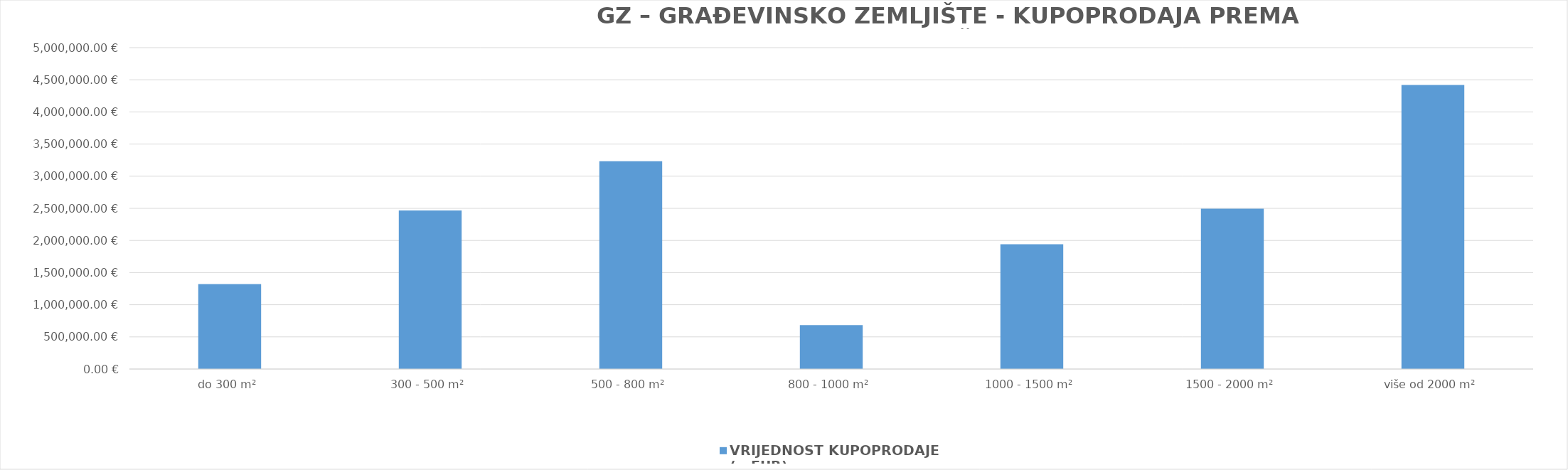
| Category | VRIJEDNOST KUPOPRODAJE (u EUR) |
|---|---|
| do 300 m² | 1322007.07 |
| 300 - 500 m² | 2467705.975 |
| 500 - 800 m² | 3232012.844 |
| 800 - 1000 m² | 683603.617 |
| 1000 - 1500 m² | 1941324.398 |
| 1500 - 2000 m² | 2493880.162 |
| više od 2000 m² | 4420292.556 |